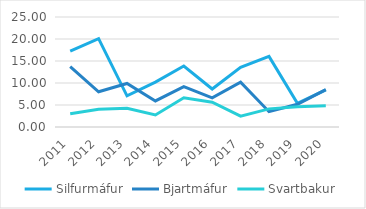
| Category | Silfurmáfur | Bjartmáfur | Svartbakur |
|---|---|---|---|
| 2011.0 | 17.242 | 13.725 | 3.007 |
| 2012.0 | 20.089 | 8.009 | 4.057 |
| 2013.0 | 7.08 | 9.89 | 4.252 |
| 2014.0 | 10.204 | 5.924 | 2.728 |
| 2015.0 | 13.87 | 9.19 | 6.655 |
| 2016.0 | 8.637 | 6.625 | 5.635 |
| 2017.0 | 13.569 | 10.204 | 2.454 |
| 2018.0 | 16.047 | 3.485 | 4.12 |
| 2019.0 | 5.374 | 5.158 | 4.58 |
| 2020.0 | 8.451 | 8.486 | 4.828 |